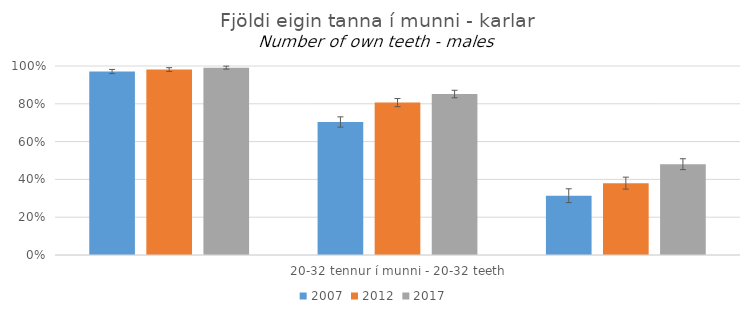
| Category | 2007 | 2012 | 2017 |
|---|---|---|---|
| 0 | 0.971 | 0.981 | 0.991 |
| 1 | 0.704 | 0.806 | 0.852 |
| 2 | 0.314 | 0.38 | 0.481 |